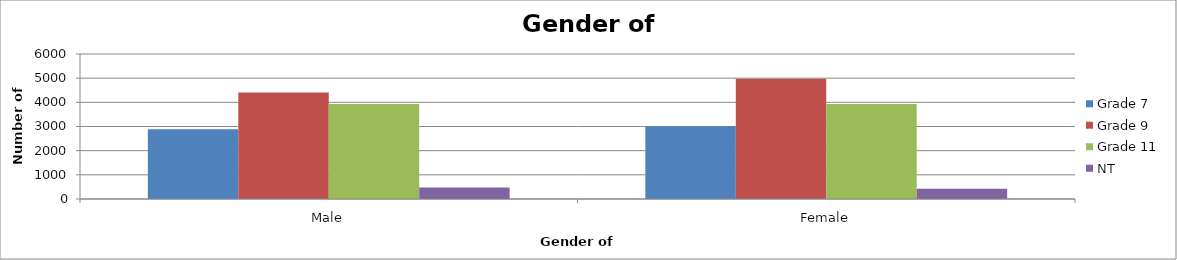
| Category | Grade 7 | Grade 9 | Grade 11 | NT |
|---|---|---|---|---|
| Male | 2887.57 | 4408.13 | 3928.5 | 473.29 |
| Female | 3005.43 | 4970.87 | 3928.5 | 419.71 |